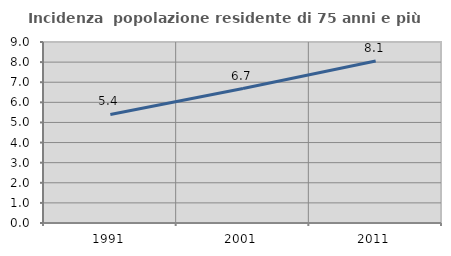
| Category | Incidenza  popolazione residente di 75 anni e più |
|---|---|
| 1991.0 | 5.395 |
| 2001.0 | 6.686 |
| 2011.0 | 8.056 |